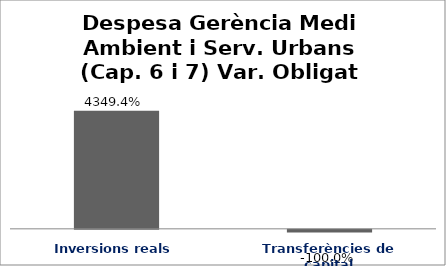
| Category | Series 0 |
|---|---|
| Inversions reals | 43.494 |
| Transferències de capital | -1 |